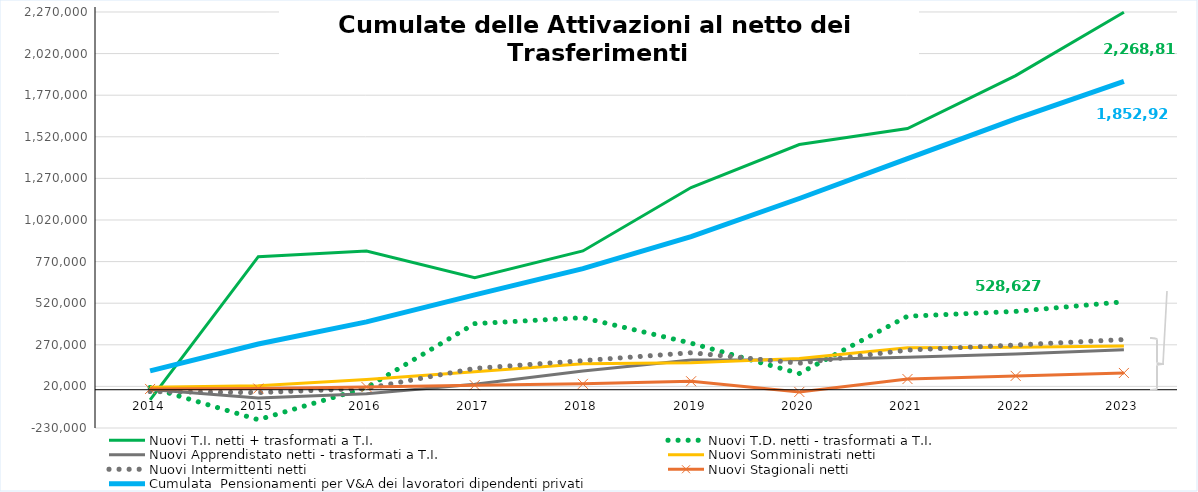
| Category | Nuovi T.I. netti + trasformati a T.I. | Nuovi T.D. netti - trasformati a T.I.  | Nuovi Apprendistato netti - trasformati a T.I. | Nuovi Somministrati netti | Nuovi Intermittenti netti | Nuovi Stagionali netti  | Cumulata  Pensionamenti per V&A dei lavoratori dipendenti privati |
|---|---|---|---|---|---|---|---|
| 2014.0 | -60562 | 13621 | 1150 | 15493 | -11300 | 4624 | 113074 |
| 2015.0 | 799568 | -180384 | -49655 | 24450 | -17294 | 7127 | 274747 |
| 2016.0 | 833271 | 12822 | -24422 | 61930 | 7993 | 16296 | 407965 |
| 2017.0 | 673665 | 397176 | 33226 | 107323 | 128119 | 27584 | 569817 |
| 2018.0 | 833858 | 432981 | 111881 | 156311 | 174849 | 35257 | 727541 |
| 2019.0 | 1215166 | 279834 | 178246 | 161437 | 222372 | 50991 | 920637 |
| 2020.0 | 1473344 | 97515 | 179561 | 187423 | 159467 | -13200 | 1149251 |
| 2021.0 | 1569719 | 441564 | 195364 | 251942 | 238302 | 64197 | 1389157 |
| 2022.0 | 1887824 | 470721 | 214456 | 255781 | 268742 | 83190 | 1627129 |
| 2023.0 | 2268812 | 528627 | 240654 | 263361 | 301566 | 100745 | 1852925 |